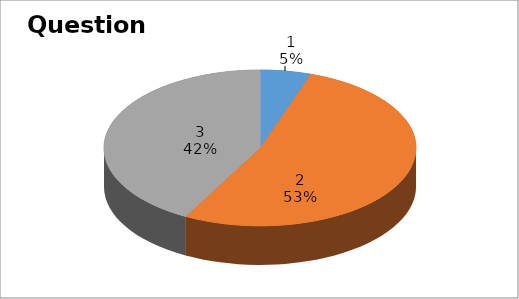
| Category | Series 0 |
|---|---|
| 0 | 1 |
| 1 | 10 |
| 2 | 8 |